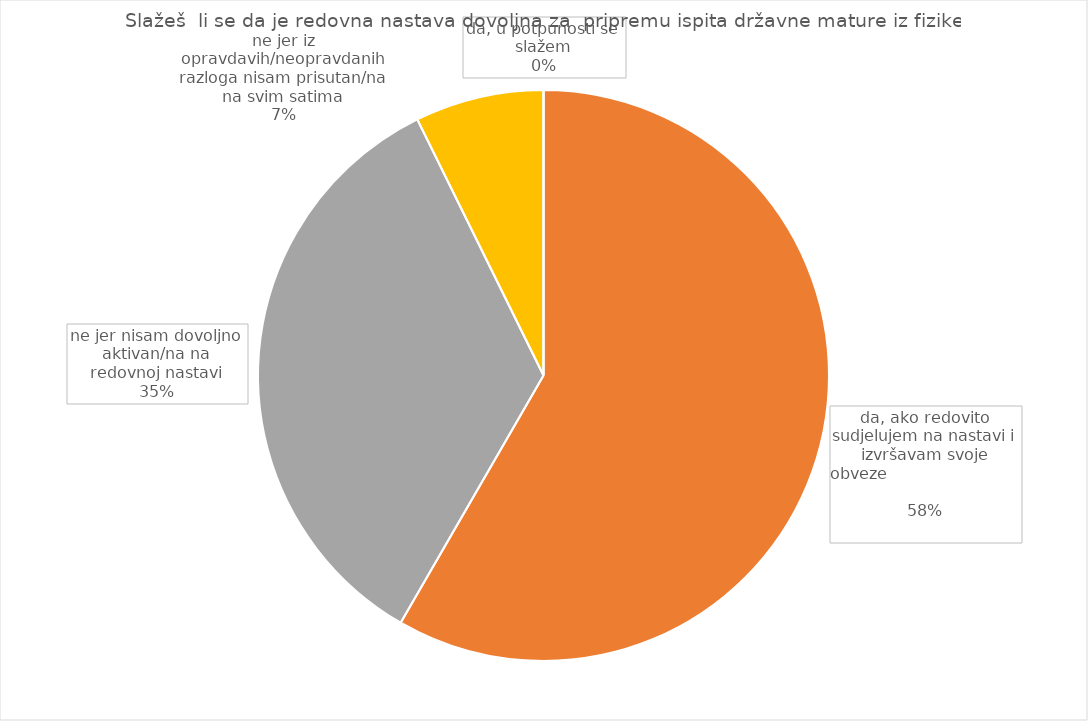
| Category | Series 0 |
|---|---|
| da, u potpunosti se slažem | 0 |
| da, ako redovito sudjelujem na nastavi i izvršavam svoje obveze                                                                  | 56 |
| ne jer nisam dovoljno aktivan/na na redovnoj nastavi | 33 |
| ne jer iz opravdavih/neopravdanih razloga nisam prisutan/na na svim satima | 7 |